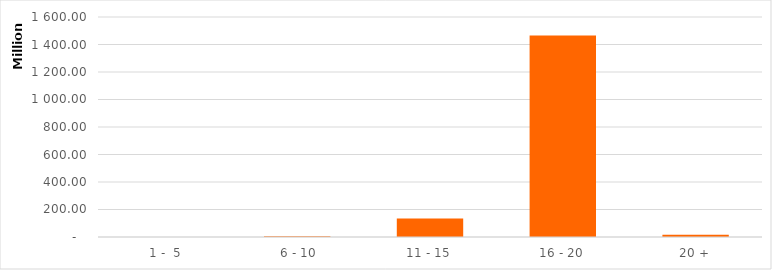
| Category | Series 0 |
|---|---|
|  1 -  5 | 0 |
|  6 - 10 | 6072407.08 |
| 11 - 15 | 134337293.42 |
| 16 - 20 | 1465296998.18 |
| 20 + | 16301896.2 |